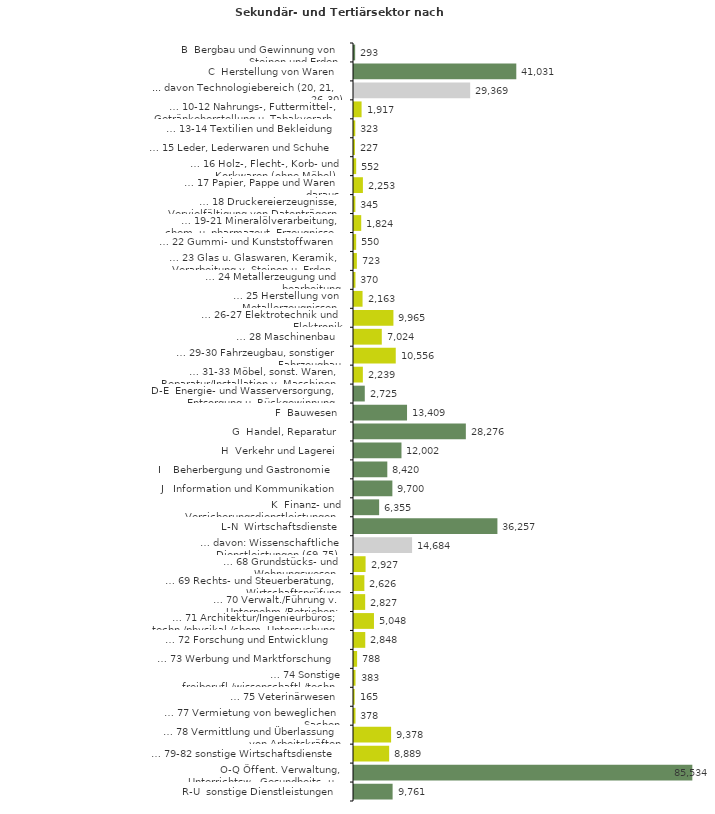
| Category | Series 0 |
|---|---|
| B  Bergbau und Gewinnung von Steinen und Erden | 293 |
| C  Herstellung von Waren | 41031 |
| ... davon Technologiebereich (20, 21, 26-30) | 29369 |
| … 10-12 Nahrungs-, Futtermittel-, Getränkeherstellung u. Tabakverarb. | 1917 |
| … 13-14 Textilien und Bekleidung | 323 |
| … 15 Leder, Lederwaren und Schuhe | 227 |
| … 16 Holz-, Flecht-, Korb- und Korkwaren (ohne Möbel)  | 552 |
| … 17 Papier, Pappe und Waren daraus  | 2253 |
| … 18 Druckereierzeugnisse, Vervielfältigung von Datenträgern | 345 |
| … 19-21 Mineralölverarbeitung, chem. u. pharmazeut. Erzeugnisse | 1824 |
| … 22 Gummi- und Kunststoffwaren | 550 |
| … 23 Glas u. Glaswaren, Keramik, Verarbeitung v. Steinen u. Erden  | 723 |
| … 24 Metallerzeugung und -bearbeitung | 370 |
| … 25 Herstellung von Metallerzeugnissen  | 2163 |
| … 26-27 Elektrotechnik und Elektronik | 9965 |
| … 28 Maschinenbau | 7024 |
| … 29-30 Fahrzeugbau, sonstiger Fahrzeugbau | 10556 |
| … 31-33 Möbel, sonst. Waren, Reparatur/Installation v. Maschinen | 2239 |
| D-E  Energie- und Wasserversorgung, Entsorgung u. Rückgewinnung | 2725 |
| F  Bauwesen | 13409 |
| G  Handel, Reparatur | 28276 |
| H  Verkehr und Lagerei | 12002 |
| I    Beherbergung und Gastronomie | 8420 |
| J   Information und Kommunikation | 9700 |
| K  Finanz- und Versicherungsdienstleistungen | 6355 |
| L-N  Wirtschaftsdienste | 36257 |
| … davon: Wissenschaftliche Dienstleistungen (69-75) | 14684 |
| … 68 Grundstücks- und Wohnungswesen  | 2927 |
| … 69 Rechts- und Steuerberatung, Wirtschaftsprüfung | 2626 |
| … 70 Verwalt./Führung v. Unternehm./Betrieben; Unternehmensberat. | 2827 |
| … 71 Architektur/Ingenieurbüros; techn./physikal./chem. Untersuchung | 5048 |
| … 72 Forschung und Entwicklung  | 2848 |
| … 73 Werbung und Marktforschung | 788 |
| … 74 Sonstige freiberufl./wissenschaftl./techn. Tätigkeiten | 383 |
| … 75 Veterinärwesen | 165 |
| … 77 Vermietung von beweglichen Sachen  | 378 |
| … 78 Vermittlung und Überlassung von Arbeitskräften | 9378 |
| … 79-82 sonstige Wirtschaftsdienste | 8889 |
| O-Q Öffent. Verwaltung, Unterrichtsw., Gesundheits- u. Sozialwesen | 85534 |
| R-U  sonstige Dienstleistungen | 9761 |